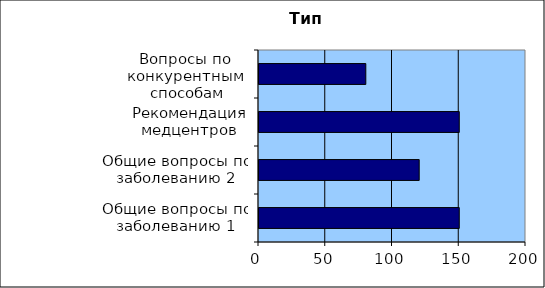
| Category | Series 0 |
|---|---|
| Общие вопросы по заболеванию 1 | 150 |
| Общие вопросы по заболеванию 2 | 120 |
| Рекомендация медцентров | 150 |
| Вопросы по конкурентным
 способам лечения | 80 |